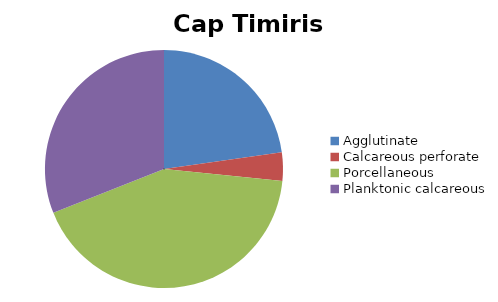
| Category | Cap Timiris shelf |
|---|---|
| ﻿Agglutinate | 22.748 |
| Calcareous perforate | 3.845 |
| Porcellaneous | 42.4 |
| Planktonic calcareous | 31.006 |